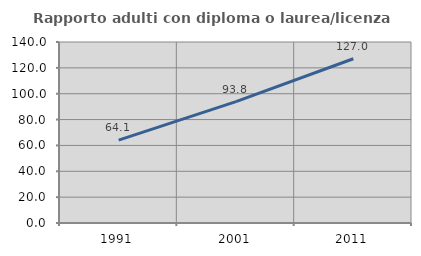
| Category | Rapporto adulti con diploma o laurea/licenza media  |
|---|---|
| 1991.0 | 64.11 |
| 2001.0 | 93.827 |
| 2011.0 | 127.027 |